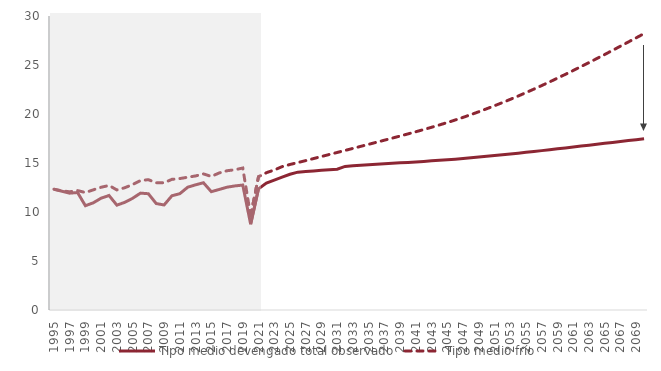
| Category | Tipo medio devengado total observado | Tipo medio frío |
|---|---|---|
| 1995.0 | 12.325 | 12.325 |
| 1996.0 | 12.122 | 12.157 |
| 1997.0 | 11.921 | 12.065 |
| 1998.0 | 11.987 | 12.184 |
| 1999.0 | 10.642 | 11.988 |
| 2000.0 | 10.937 | 12.257 |
| 2001.0 | 11.413 | 12.528 |
| 2002.0 | 11.684 | 12.705 |
| 2003.0 | 10.699 | 12.251 |
| 2004.0 | 10.986 | 12.477 |
| 2005.0 | 11.397 | 12.8 |
| 2006.0 | 11.926 | 13.206 |
| 2007.0 | 11.863 | 13.3 |
| 2008.0 | 10.863 | 12.98 |
| 2009.0 | 10.718 | 12.982 |
| 2010.0 | 11.66 | 13.333 |
| 2011.0 | 11.868 | 13.413 |
| 2012.0 | 12.528 | 13.545 |
| 2013.0 | 12.773 | 13.679 |
| 2014.0 | 12.985 | 13.887 |
| 2015.0 | 12.074 | 13.632 |
| 2016.0 | 12.299 | 13.983 |
| 2017.0 | 12.531 | 14.212 |
| 2018.0 | 12.662 | 14.312 |
| 2019.0 | 12.75 | 14.487 |
| 2020.0 | 8.748 | 9.613 |
| 2021.0 | 12.372 | 13.606 |
| 2022.0 | 12.954 | 14.009 |
| 2023.0 | 13.247 | 14.283 |
| 2024.0 | 13.56 | 14.63 |
| 2025.0 | 13.852 | 14.849 |
| 2026.0 | 14.064 | 15.045 |
| 2027.0 | 14.127 | 15.244 |
| 2028.0 | 14.189 | 15.453 |
| 2029.0 | 14.249 | 15.661 |
| 2030.0 | 14.307 | 15.868 |
| 2031.0 | 14.363 | 16.074 |
| 2032.0 | 14.655 | 16.282 |
| 2033.0 | 14.709 | 16.49 |
| 2034.0 | 14.762 | 16.7 |
| 2035.0 | 14.813 | 16.907 |
| 2036.0 | 14.863 | 17.116 |
| 2037.0 | 14.914 | 17.326 |
| 2038.0 | 14.964 | 17.539 |
| 2039.0 | 15.013 | 17.753 |
| 2040.0 | 15.063 | 17.97 |
| 2041.0 | 15.113 | 18.19 |
| 2042.0 | 15.165 | 18.416 |
| 2043.0 | 15.218 | 18.647 |
| 2044.0 | 15.274 | 18.885 |
| 2045.0 | 15.331 | 19.131 |
| 2046.0 | 15.393 | 19.388 |
| 2047.0 | 15.458 | 19.657 |
| 2048.0 | 15.528 | 19.939 |
| 2049.0 | 15.601 | 20.231 |
| 2050.0 | 15.677 | 20.535 |
| 2051.0 | 15.754 | 20.844 |
| 2052.0 | 15.834 | 21.166 |
| 2053.0 | 15.916 | 21.495 |
| 2054.0 | 16 | 21.834 |
| 2055.0 | 16.086 | 22.183 |
| 2056.0 | 16.174 | 22.54 |
| 2057.0 | 16.263 | 22.905 |
| 2058.0 | 16.354 | 23.278 |
| 2059.0 | 16.445 | 23.659 |
| 2060.0 | 16.538 | 24.047 |
| 2061.0 | 16.631 | 24.44 |
| 2062.0 | 16.725 | 24.841 |
| 2063.0 | 16.819 | 25.247 |
| 2064.0 | 16.913 | 25.659 |
| 2065.0 | 17.006 | 26.073 |
| 2066.0 | 17.1 | 26.496 |
| 2067.0 | 17.193 | 26.921 |
| 2068.0 | 17.285 | 27.347 |
| 2069.0 | 17.375 | 27.774 |
| 2070.0 | 17.464 | 28.204 |